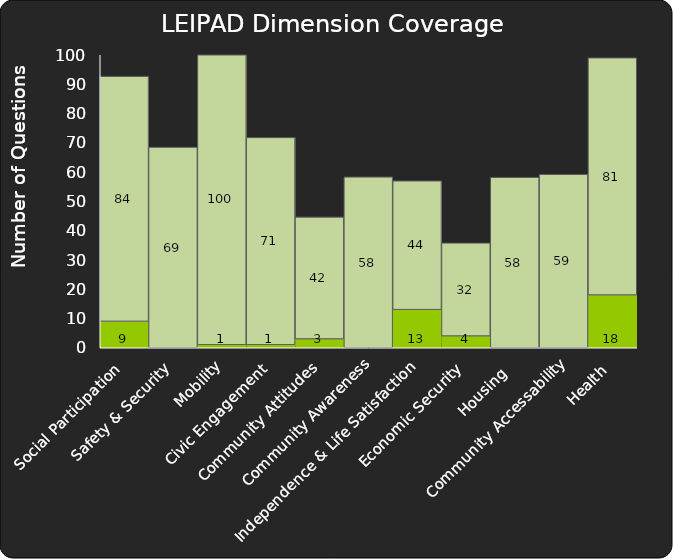
| Category | Series 0 | Series 1 |
|---|---|---|
|  Social Participation | 9 | 83.7 |
| Safety & Security | 0 | 68.5 |
| Mobility | 1 | 100 |
| Civic Engagement | 1 | 70.8 |
| Community Attitudes | 3 | 41.667 |
| Community Awareness | 0 | 58.333 |
| Independence & Life Satisfaction | 13 | 44 |
| Economic Security | 4 | 31.8 |
| Housing  | 0 | 58.209 |
| Community Accessability | 0 | 59.236 |
| Health | 18 | 81 |